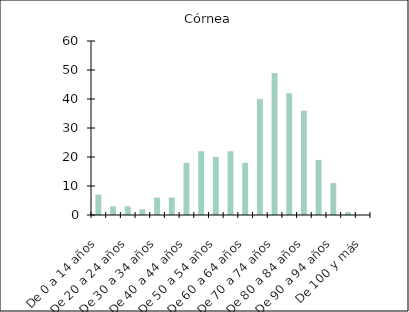
| Category | Córnea |
|---|---|
| De 0 a 14 años | 7 |
| De 15 a 19 años | 3 |
| De 20 a 24 años | 3 |
| De 25 a 29 años | 2 |
| De 30 a 34 años | 6 |
| De 35 a 39 años | 6 |
| De 40 a 44 años | 18 |
| De 45 a 49 años | 22 |
| De 50 a 54 años | 20 |
| De 55 a 59 años | 22 |
| De 60 a 64 años | 18 |
| De 65 a 69 años | 40 |
| De 70 a 74 años | 49 |
| De 75 a 79 años | 42 |
| De 80 a 84 años | 36 |
| De 85 a 89 años | 19 |
| De 90 a 94 años | 11 |
| De 95 a 99 años | 1 |
| De 100 y más | 0 |